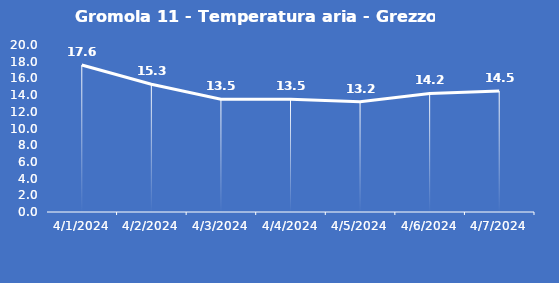
| Category | Gromola 11 - Temperatura aria - Grezzo (°C) |
|---|---|
| 4/1/24 | 17.6 |
| 4/2/24 | 15.3 |
| 4/3/24 | 13.5 |
| 4/4/24 | 13.5 |
| 4/5/24 | 13.2 |
| 4/6/24 | 14.2 |
| 4/7/24 | 14.5 |